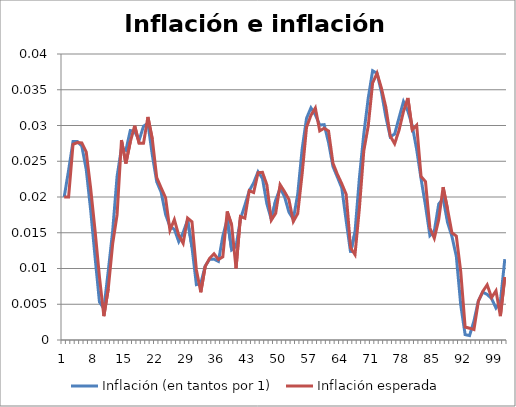
| Category | Inflación (en tantos por 1) | Inflación esperada |
|---|---|---|
| 0 | 0.02 | 0.02 |
| 1 | 0.024 | 0.02 |
| 2 | 0.028 | 0.027 |
| 3 | 0.028 | 0.028 |
| 4 | 0.027 | 0.028 |
| 5 | 0.024 | 0.026 |
| 6 | 0.018 | 0.021 |
| 7 | 0.012 | 0.015 |
| 8 | 0.005 | 0.009 |
| 9 | 0.004 | 0.003 |
| 10 | 0.01 | 0.007 |
| 11 | 0.015 | 0.013 |
| 12 | 0.023 | 0.017 |
| 13 | 0.027 | 0.028 |
| 14 | 0.027 | 0.025 |
| 15 | 0.029 | 0.028 |
| 16 | 0.029 | 0.03 |
| 17 | 0.028 | 0.028 |
| 18 | 0.03 | 0.028 |
| 19 | 0.03 | 0.031 |
| 20 | 0.026 | 0.028 |
| 21 | 0.022 | 0.023 |
| 22 | 0.021 | 0.021 |
| 23 | 0.018 | 0.02 |
| 24 | 0.016 | 0.015 |
| 25 | 0.015 | 0.017 |
| 26 | 0.014 | 0.015 |
| 27 | 0.015 | 0.014 |
| 28 | 0.017 | 0.017 |
| 29 | 0.013 | 0.017 |
| 30 | 0.008 | 0.01 |
| 31 | 0.008 | 0.007 |
| 32 | 0.01 | 0.01 |
| 33 | 0.011 | 0.011 |
| 34 | 0.011 | 0.012 |
| 35 | 0.011 | 0.011 |
| 36 | 0.015 | 0.012 |
| 37 | 0.017 | 0.018 |
| 38 | 0.013 | 0.016 |
| 39 | 0.013 | 0.01 |
| 40 | 0.017 | 0.017 |
| 41 | 0.019 | 0.017 |
| 42 | 0.021 | 0.021 |
| 43 | 0.022 | 0.021 |
| 44 | 0.024 | 0.023 |
| 45 | 0.023 | 0.023 |
| 46 | 0.019 | 0.022 |
| 47 | 0.017 | 0.017 |
| 48 | 0.02 | 0.018 |
| 49 | 0.021 | 0.022 |
| 50 | 0.02 | 0.021 |
| 51 | 0.018 | 0.02 |
| 52 | 0.017 | 0.017 |
| 53 | 0.02 | 0.018 |
| 54 | 0.027 | 0.023 |
| 55 | 0.031 | 0.03 |
| 56 | 0.032 | 0.031 |
| 57 | 0.031 | 0.032 |
| 58 | 0.03 | 0.029 |
| 59 | 0.03 | 0.03 |
| 60 | 0.028 | 0.029 |
| 61 | 0.024 | 0.025 |
| 62 | 0.023 | 0.023 |
| 63 | 0.021 | 0.022 |
| 64 | 0.017 | 0.02 |
| 65 | 0.012 | 0.013 |
| 66 | 0.015 | 0.012 |
| 67 | 0.023 | 0.018 |
| 68 | 0.029 | 0.026 |
| 69 | 0.034 | 0.03 |
| 70 | 0.038 | 0.036 |
| 71 | 0.037 | 0.037 |
| 72 | 0.035 | 0.035 |
| 73 | 0.031 | 0.033 |
| 74 | 0.028 | 0.029 |
| 75 | 0.029 | 0.027 |
| 76 | 0.031 | 0.029 |
| 77 | 0.033 | 0.032 |
| 78 | 0.032 | 0.034 |
| 79 | 0.03 | 0.029 |
| 80 | 0.027 | 0.03 |
| 81 | 0.023 | 0.023 |
| 82 | 0.019 | 0.022 |
| 83 | 0.015 | 0.016 |
| 84 | 0.015 | 0.014 |
| 85 | 0.019 | 0.017 |
| 86 | 0.02 | 0.021 |
| 87 | 0.016 | 0.018 |
| 88 | 0.014 | 0.015 |
| 89 | 0.012 | 0.015 |
| 90 | 0.005 | 0.01 |
| 91 | 0.001 | 0.002 |
| 92 | 0.001 | 0.002 |
| 93 | 0.003 | 0.001 |
| 94 | 0.005 | 0.005 |
| 95 | 0.007 | 0.007 |
| 96 | 0.006 | 0.008 |
| 97 | 0.006 | 0.006 |
| 98 | 0.004 | 0.007 |
| 99 | 0.005 | 0.003 |
| 100 | 0.011 | 0.009 |